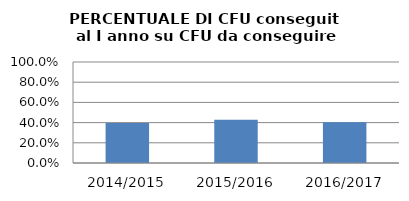
| Category | 2014/2015 2015/2016 2016/2017 |
|---|---|
| 2014/2015 | 0.395 |
| 2015/2016 | 0.429 |
| 2016/2017 | 0.403 |